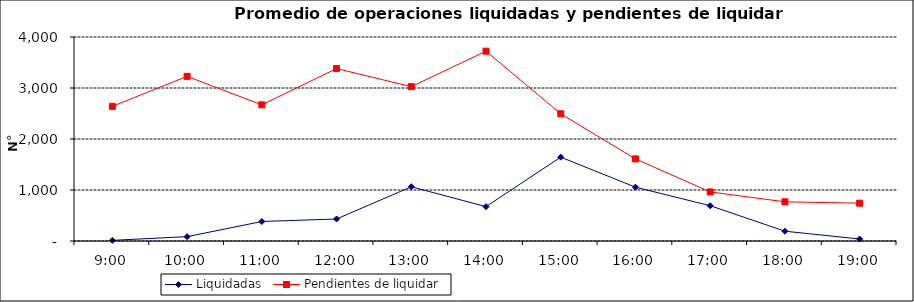
| Category | Liquidadas | Pendientes de liquidar |
|---|---|---|
| 0.375 | 12.591 | 2640.864 |
| 0.4166666666666667 | 85.182 | 3228.227 |
| 0.4583333333333333 | 382.636 | 2669.955 |
| 0.5 | 431.5 | 3380.864 |
| 0.5416666666666666 | 1063.318 | 3026.364 |
| 0.5833333333333334 | 674.227 | 3722.409 |
| 0.625 | 1644.091 | 2494.409 |
| 0.6666666666666666 | 1055.045 | 1609.955 |
| 0.7083333333333334 | 692.364 | 962.545 |
| 0.75 | 191.955 | 768.227 |
| 0.7916666666666666 | 39.5 | 741.682 |